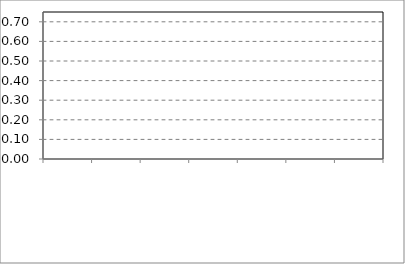
| Category | Chart Adjustment |
|---|---|
| 0 | 0 |
| 1 | 0 |
| 2 | 0 |
| 3 | 0 |
| 4 | 0 |
| 5 | 0 |
| 6 | 0 |